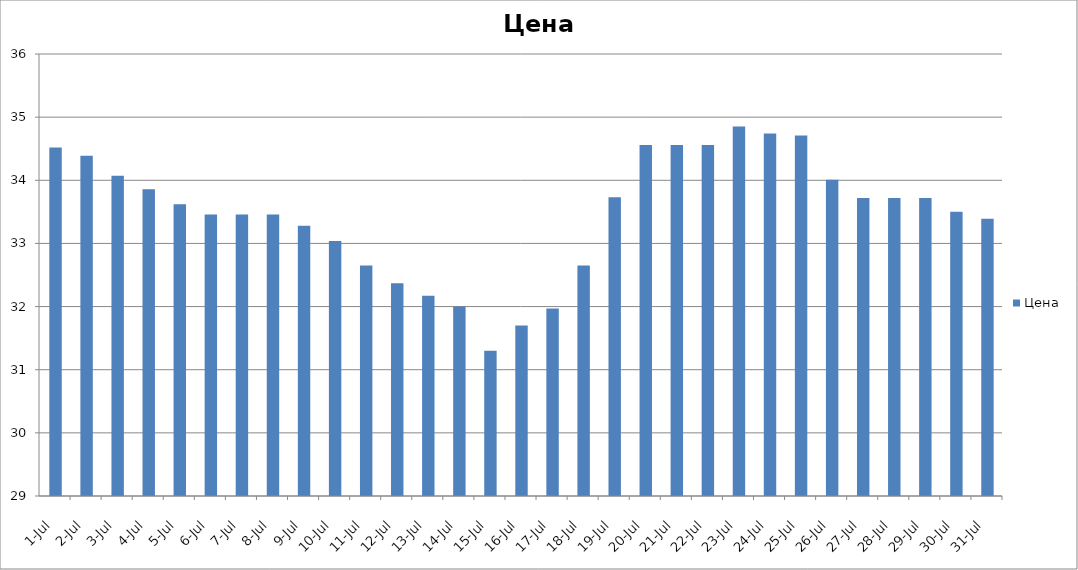
| Category | Цена |
|---|---|
| 2018-07-01 | 34.52 |
| 2018-07-02 | 34.39 |
| 2018-07-03 | 34.07 |
| 2018-07-04 | 33.86 |
| 2018-07-05 | 33.62 |
| 2018-07-06 | 33.46 |
| 2018-07-07 | 33.46 |
| 2018-07-08 | 33.46 |
| 2018-07-09 | 33.28 |
| 2018-07-10 | 33.04 |
| 2018-07-11 | 32.65 |
| 2018-07-12 | 32.37 |
| 2018-07-13 | 32.17 |
| 2018-07-14 | 32 |
| 2018-07-15 | 31.3 |
| 2018-07-16 | 31.7 |
| 2018-07-17 | 31.97 |
| 2018-07-18 | 32.65 |
| 2018-07-19 | 33.73 |
| 2018-07-20 | 34.56 |
| 2018-07-21 | 34.56 |
| 2018-07-22 | 34.56 |
| 2018-07-23 | 34.85 |
| 2018-07-24 | 34.74 |
| 2018-07-25 | 34.71 |
| 2018-07-26 | 34.01 |
| 2018-07-27 | 33.72 |
| 2018-07-28 | 33.72 |
| 2018-07-29 | 33.72 |
| 2018-07-30 | 33.5 |
| 2018-07-31 | 33.39 |